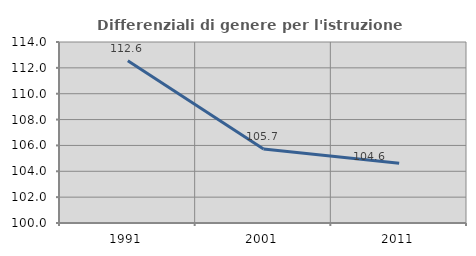
| Category | Differenziali di genere per l'istruzione superiore |
|---|---|
| 1991.0 | 112.556 |
| 2001.0 | 105.729 |
| 2011.0 | 104.627 |